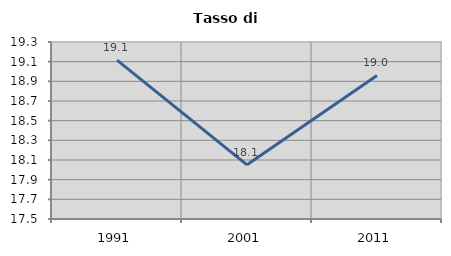
| Category | Tasso di disoccupazione   |
|---|---|
| 1991.0 | 19.116 |
| 2001.0 | 18.051 |
| 2011.0 | 18.96 |